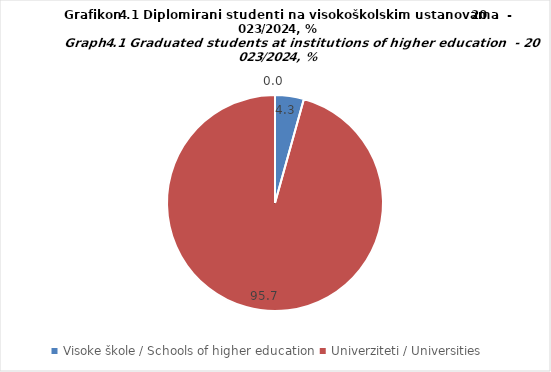
| Category | % |
|---|---|
| Visoke škole / Schools of higher education | 4.313 |
| Univerziteti / Universities | 95.687 |